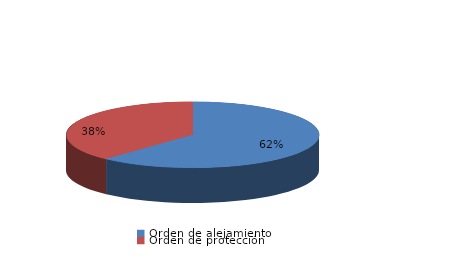
| Category | Series 0 |
|---|---|
| Orden de alejamiento | 13 |
| Orden de protección | 8 |